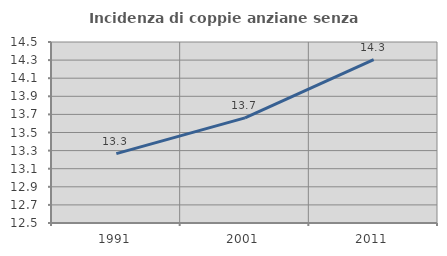
| Category | Incidenza di coppie anziane senza figli  |
|---|---|
| 1991.0 | 13.267 |
| 2001.0 | 13.661 |
| 2011.0 | 14.305 |